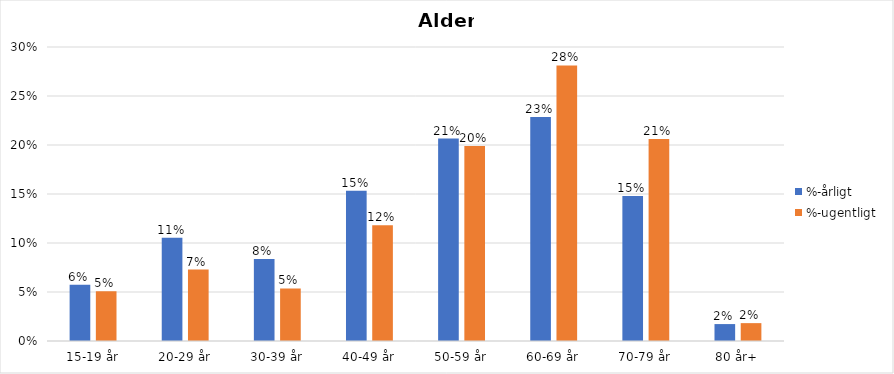
| Category | %-årligt | %-ugentligt |
|---|---|---|
| 15-19 år | 0.057 | 0.051 |
| 20-29 år | 0.105 | 0.073 |
| 30-39 år | 0.084 | 0.054 |
| 40-49 år | 0.153 | 0.118 |
| 50-59 år | 0.207 | 0.199 |
| 60-69 år | 0.229 | 0.281 |
| 70-79 år | 0.148 | 0.206 |
| 80 år+ | 0.017 | 0.018 |